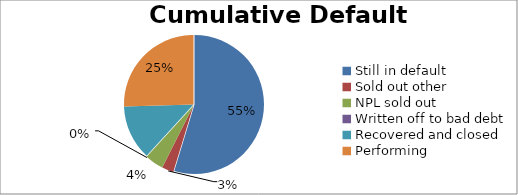
| Category | Cumulative Default Breakdown |
|---|---|
| Still in default | 0.547 |
| Sold out other | 0.027 |
| NPL sold out | 0.044 |
| Written off to bad debt | 0 |
| Recovered and closed | 0.127 |
| Performing | 0.255 |